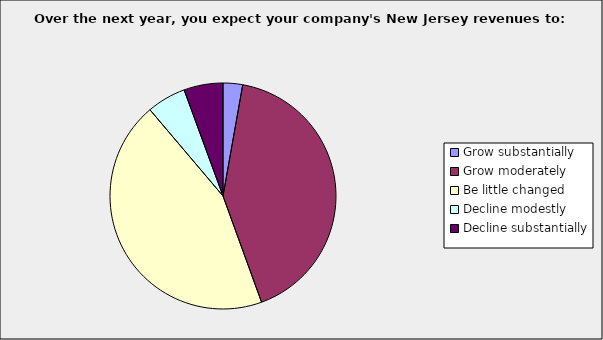
| Category | Series 0 |
|---|---|
| Grow substantially | 0.028 |
| Grow moderately | 0.417 |
| Be little changed | 0.444 |
| Decline modestly | 0.056 |
| Decline substantially | 0.056 |